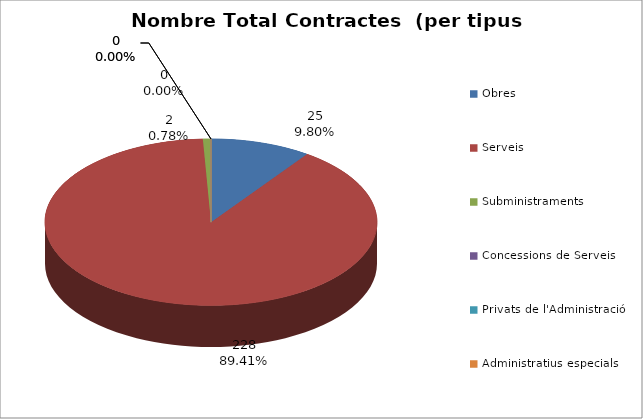
| Category | Nombre Total Contractes |
|---|---|
| Obres | 25 |
| Serveis | 228 |
| Subministraments | 2 |
| Concessions de Serveis | 0 |
| Privats de l'Administració | 0 |
| Administratius especials | 0 |